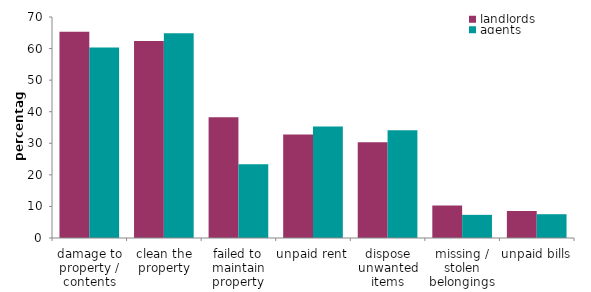
| Category | landlords | agents |
|---|---|---|
| damage to property / contents | 65.344 | 60.344 |
| clean the property | 62.415 | 64.823 |
| failed to maintain property | 38.246 | 23.356 |
| unpaid rent | 32.76 | 35.313 |
| dispose unwanted items | 30.356 | 34.105 |
| missing / stolen belongings | 10.292 | 7.336 |
| unpaid bills | 8.554 | 7.534 |